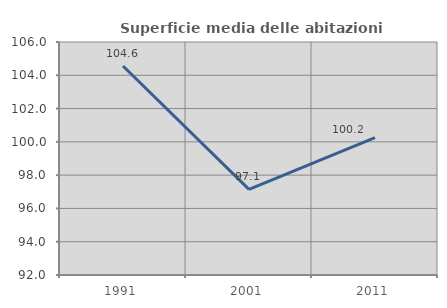
| Category | Superficie media delle abitazioni occupate |
|---|---|
| 1991.0 | 104.557 |
| 2001.0 | 97.149 |
| 2011.0 | 100.249 |